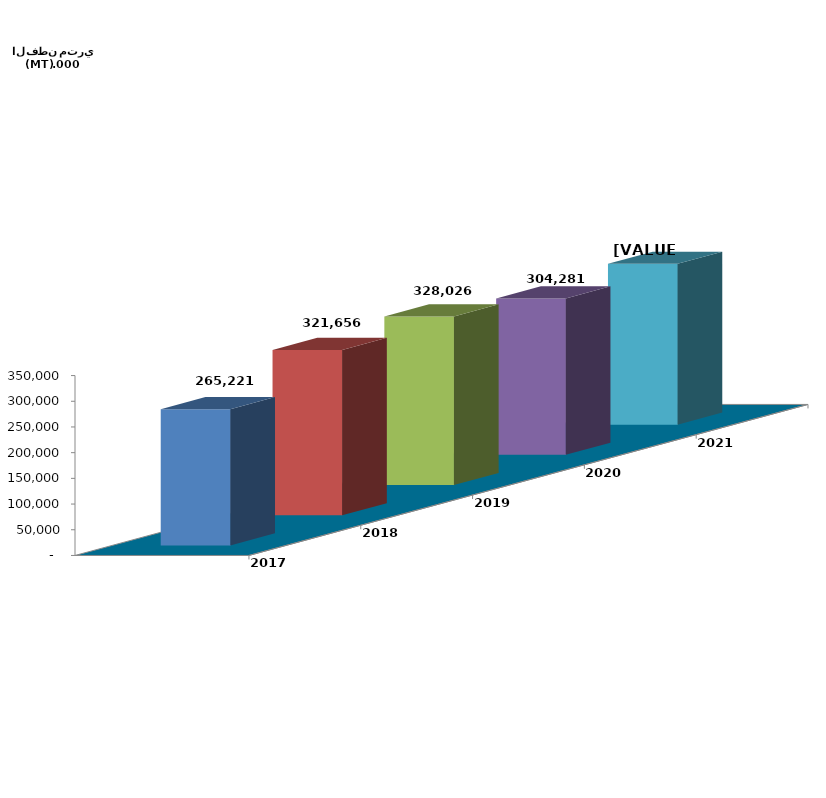
| Category | 2017 | 2018 | 2019 | 2020 | 2021 |
|---|---|---|---|---|---|
| 0 | 265220.521 | 321655.847 | 328026.378 | 304280.726 | 312938 |